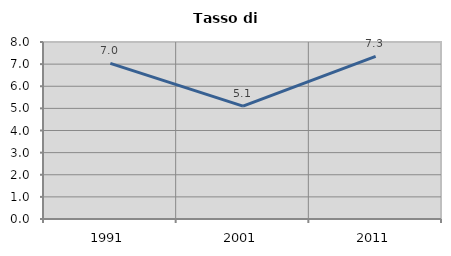
| Category | Tasso di disoccupazione   |
|---|---|
| 1991.0 | 7.036 |
| 2001.0 | 5.104 |
| 2011.0 | 7.35 |